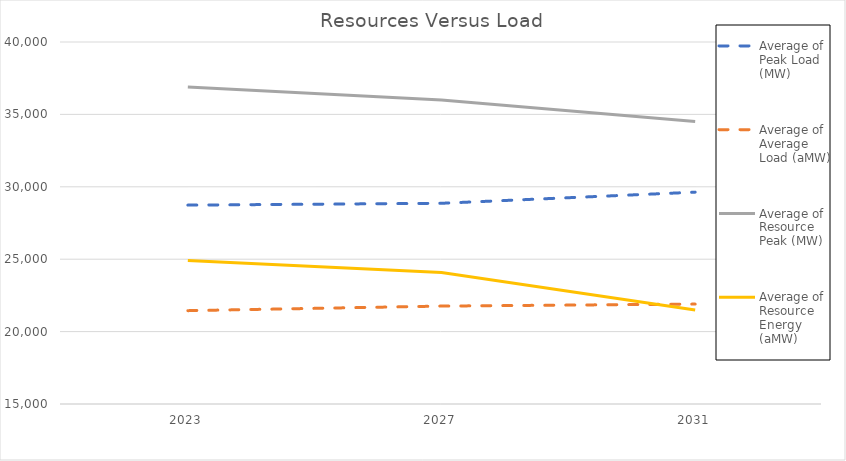
| Category | Average of Peak Load (MW) | Average of Average Load (aMW) | Average of Resource Peak (MW) | Average of Resource Energy (aMW) |
|---|---|---|---|---|
| 2023 | 28735 | 21447 | 36897.197 | 24907.901 |
| 2027 | 28861.5 | 21762.25 | 35989.197 | 24087.151 |
| 2031 | 29630.25 | 21900.75 | 34516.197 | 21497.151 |